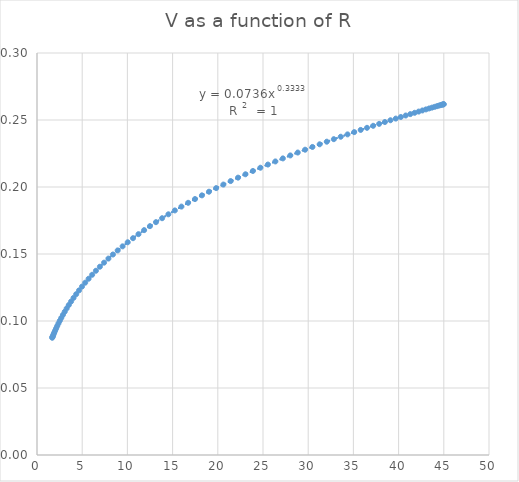
| Category | V as a function of R |
|---|---|
| 1.6804540702885802 | 0.088 |
| 1.7049290421820373 | 0.088 |
| 1.7418243416602308 | 0.089 |
| 1.791355022761845 | 0.089 |
| 1.8538007762034663 | 0.09 |
| 1.9295002894453788 | 0.092 |
| 2.018844651906683 | 0.093 |
| 2.1222700451793917 | 0.095 |
| 2.2402499560228266 | 0.096 |
| 2.3732871334865173 | 0.098 |
| 2.5219054853257403 | 0.1 |
| 2.6866420769067125 | 0.102 |
| 2.8680393622535654 | 0.105 |
| 3.0666377445935478 | 0.107 |
| 3.2829685347776905 | 0.109 |
| 3.517547351320594 | 0.112 |
| 3.7708679860011753 | 0.115 |
| 4.0433967436693425 | 0.117 |
| 4.335567253740359 | 0.12 |
| 4.647775743129975 | 0.123 |
| 4.980376755405293 | 0.126 |
| 5.333679298165888 | 0.129 |
| 5.707943399266757 | 0.132 |
| 6.103377052550636 | 0.135 |
| 6.520133534001764 | 0.138 |
| 6.958309070627745 | 0.141 |
| 7.417940845215889 | 0.144 |
| 7.899005321784622 | 0.147 |
| 8.401416877703957 | 0.15 |
| 8.92502672952822 | 0.153 |
| 9.469622141240384 | 0.156 |
| 10.034925903909107 | 0.159 |
| 10.620596077066018 | 0.162 |
| 11.226225982731023 | 0.165 |
| 11.85134444338568 | 0.168 |
| 12.495416255779709 | 0.171 |
| 13.157842892893685 | 0.174 |
| 13.837963426145741 | 0.177 |
| 14.535055660747657 | 0.18 |
| 15.248337476554878 | 0.183 |
| 15.976968366929214 | 0.185 |
| 16.72005116856574 | 0.188 |
| 17.47663397408543 | 0.191 |
| 18.245712220289157 | 0.194 |
| 19.026230943687995 | 0.196 |
| 19.81708719572669 | 0.199 |
| 20.617132609082876 | 0.202 |
| 21.425176106626168 | 0.204 |
| 22.239986744627846 | 0.207 |
| 23.060296681196373 | 0.209 |
| 23.884804260433206 | 0.212 |
| 24.71217720395078 | 0.214 |
| 25.54105589931326 | 0.217 |
| 26.370056776465386 | 0.219 |
| 27.19777576176521 | 0.221 |
| 28.022791800188227 | 0.224 |
| 28.843670435360227 | 0.226 |
| 29.658967437081436 | 0.228 |
| 30.467232466396045 | 0.23 |
| 31.267012767824365 | 0.232 |
| 32.05685687796506 | 0.234 |
| 32.83531834092669 | 0.236 |
| 33.60095941900149 | 0.238 |
| 34.35235478987079 | 0.239 |
| 35.08809521823533 | 0.241 |
| 35.806791193128966 | 0.243 |
| 36.507076520253044 | 0.244 |
| 37.18761185936354 | 0.246 |
| 37.8470881968192 | 0.247 |
| 38.484230244369726 | 0.248 |
| 39.09779975393086 | 0.25 |
| 39.686598739697466 | 0.251 |
| 40.24947259888289 | 0.252 |
| 40.785313121851914 | 0.253 |
| 41.29306138426067 | 0.254 |
| 41.77171051212989 | 0.255 |
| 42.22030831359869 | 0.256 |
| 42.6379597687393 | 0.257 |
| 43.02382937167008 | 0.258 |
| 43.3771433182717 | 0.259 |
| 43.69719153238819 | 0.259 |
| 43.98332952771897 | 0.26 |
| 44.23498009626228 | 0.26 |
| 44.45163482281269 | 0.261 |
| 44.632855418488795 | 0.261 |
| 44.778274870625005 | 0.261 |
| 44.88759840632519 | 0.262 |
| 44.960604265898915 | 0.262 |
| 44.99714428538917 | 0.262 |